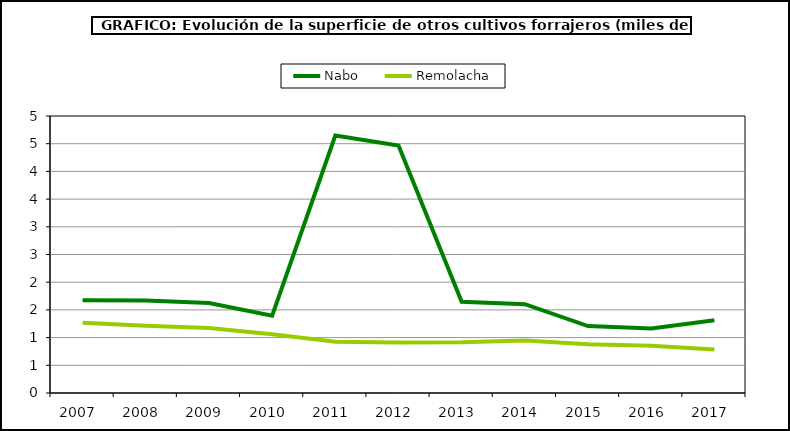
| Category | Nabo | Remolacha |
|---|---|---|
| 2007.0 | 1.674 | 1.267 |
| 2008.0 | 1.67 | 1.212 |
| 2009.0 | 1.623 | 1.175 |
| 2010.0 | 1.395 | 1.06 |
| 2011.0 | 4.647 | 0.925 |
| 2012.0 | 4.467 | 0.913 |
| 2013.0 | 1.647 | 0.917 |
| 2014.0 | 1.603 | 0.949 |
| 2015.0 | 1.208 | 0.881 |
| 2016.0 | 1.165 | 0.854 |
| 2017.0 | 1.315 | 0.786 |